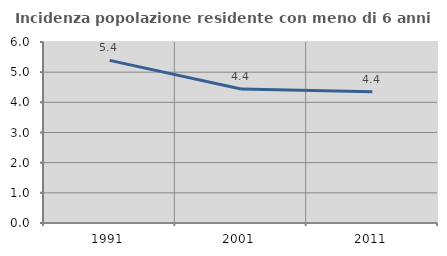
| Category | Incidenza popolazione residente con meno di 6 anni |
|---|---|
| 1991.0 | 5.39 |
| 2001.0 | 4.44 |
| 2011.0 | 4.352 |